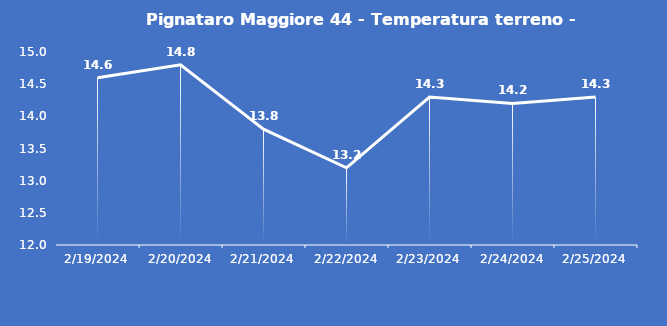
| Category | Pignataro Maggiore 44 - Temperatura terreno - Grezzo (°C) |
|---|---|
| 2/19/24 | 14.6 |
| 2/20/24 | 14.8 |
| 2/21/24 | 13.8 |
| 2/22/24 | 13.2 |
| 2/23/24 | 14.3 |
| 2/24/24 | 14.2 |
| 2/25/24 | 14.3 |